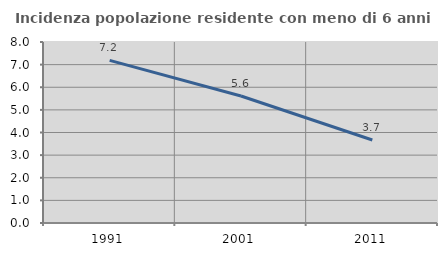
| Category | Incidenza popolazione residente con meno di 6 anni |
|---|---|
| 1991.0 | 7.189 |
| 2001.0 | 5.613 |
| 2011.0 | 3.667 |